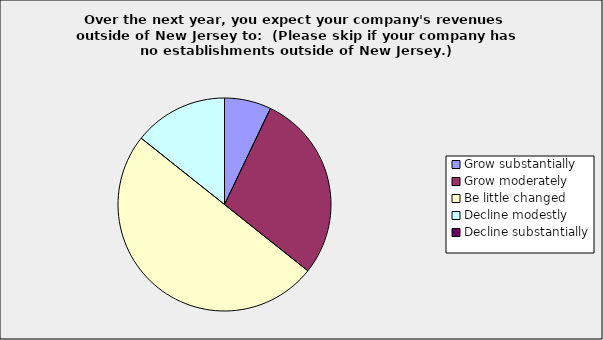
| Category | Series 0 |
|---|---|
| Grow substantially | 0.071 |
| Grow moderately | 0.286 |
| Be little changed | 0.5 |
| Decline modestly | 0.143 |
| Decline substantially | 0 |